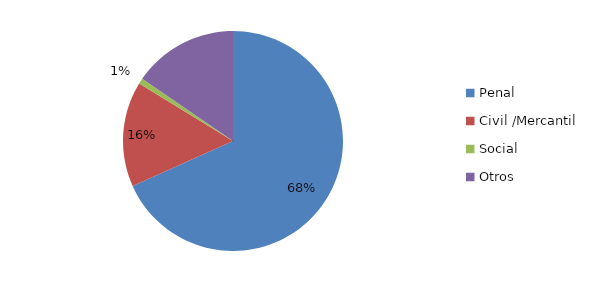
| Category | Series 0 |
|---|---|
| Penal | 84 |
| Civil /Mercantil | 19 |
| Social | 1 |
| Otros | 19 |